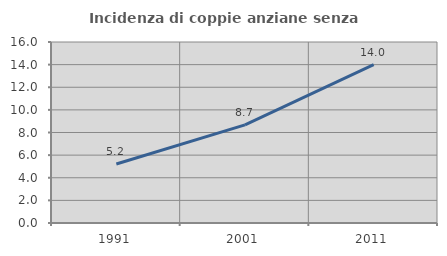
| Category | Incidenza di coppie anziane senza figli  |
|---|---|
| 1991.0 | 5.219 |
| 2001.0 | 8.676 |
| 2011.0 | 13.994 |